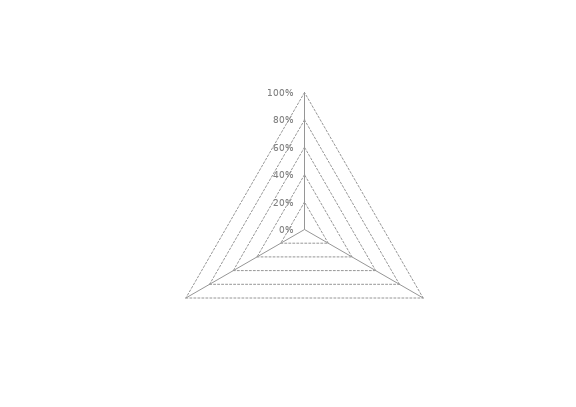
| Category | GLOBAL |
|---|---|
| FORMATION | 0 |
| RECHERCHE | 0 |
| GOUVERNANCE | 0 |